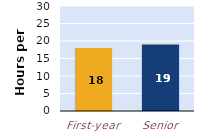
| Category | hours per week |
|---|---|
| First-year | 18 |
| Senior | 19 |